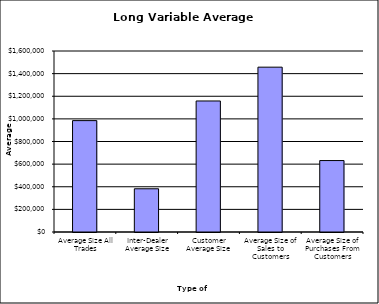
| Category | Security Type |
|---|---|
| Average Size All Trades | 984534.108 |
| Inter-Dealer Average Size | 382099.323 |
| Customer Average Size | 1158283.203 |
| Average Size of Sales to Customers | 1457084.694 |
| Average Size of Purchases From Customers | 631618.705 |